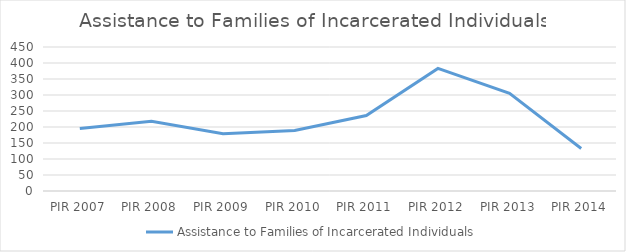
| Category | Assistance to Families of Incarcerated Individuals |
|---|---|
| PIR 2007 | 195 |
| PIR 2008 | 218 |
| PIR 2009 | 179 |
| PIR 2010 | 189 |
| PIR 2011 | 236 |
| PIR 2012 | 383 |
| PIR 2013 | 305 |
| PIR 2014 | 133 |